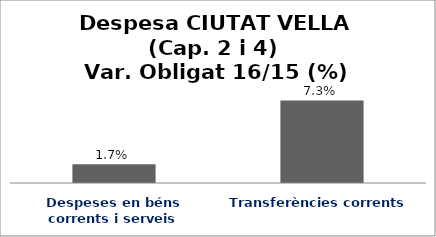
| Category | Series 0 |
|---|---|
| Despeses en béns corrents i serveis | 0.017 |
| Transferències corrents | 0.073 |